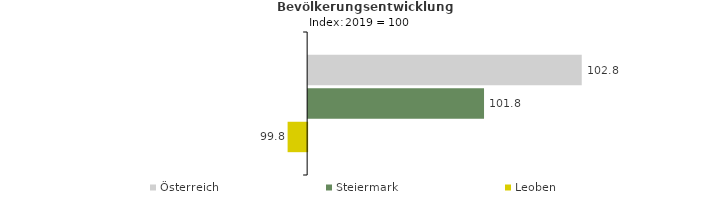
| Category | Österreich | Steiermark | Leoben |
|---|---|---|---|
| 2023.0 | 102.8 | 101.8 | 99.8 |